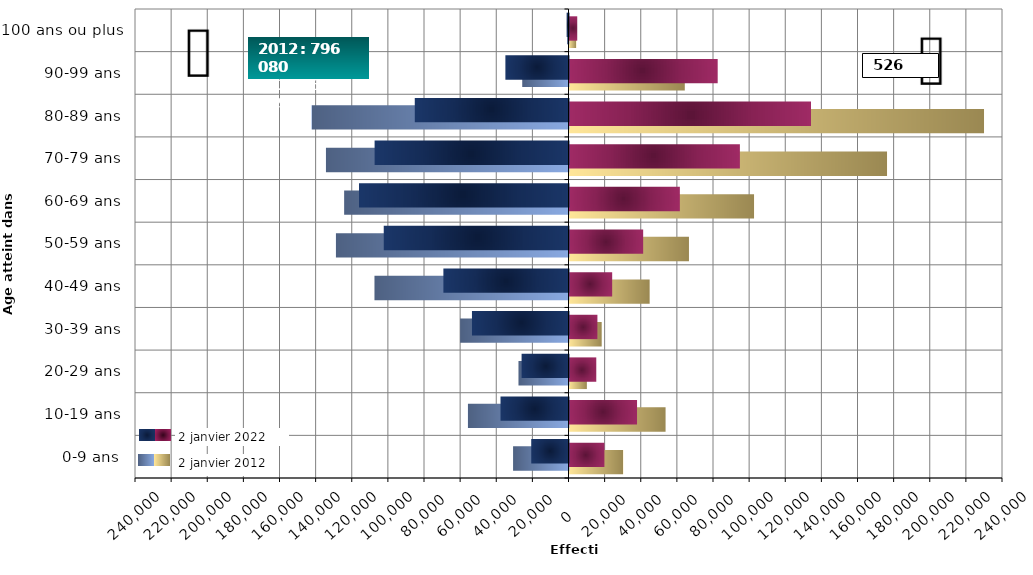
| Category | F-1 | H-1 | F | H |
|---|---|---|---|---|
| 0-9 ans | 29770 | -30683 | 19334 | -20626 |
| 10-19 ans | 53186 | -55704 | 37396 | -37642 |
| 20-29 ans | 9607 | -27694 | 14829 | -25969 |
| 30-39 ans | 17819 | -60016 | 15458 | -53453 |
| 40-49 ans | 44373 | -107421 | 23632 | -69269 |
| 50-59 ans | 66137 | -128787 | 40788 | -102290 |
| 60-69 ans | 102213 | -124209 | 61097 | -115982 |
| 70-79 ans | 175838 | -134307 | 94337 | -107350 |
| 80-89 ans | 229519 | -142280 | 133703 | -85109 |
| 90-99 ans | 63829 | -25611 | 82044 | -34939 |
| 100 ans ou plus | 3789 | -809 | 4286 | -1030 |